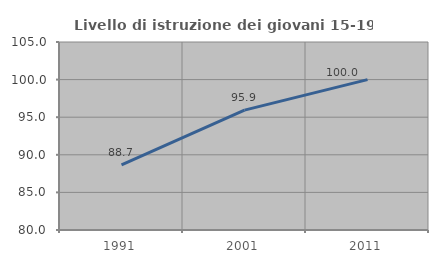
| Category | Livello di istruzione dei giovani 15-19 anni |
|---|---|
| 1991.0 | 88.66 |
| 2001.0 | 95.946 |
| 2011.0 | 100 |